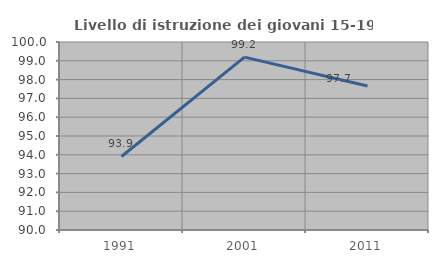
| Category | Livello di istruzione dei giovani 15-19 anni |
|---|---|
| 1991.0 | 93.91 |
| 2001.0 | 99.194 |
| 2011.0 | 97.664 |